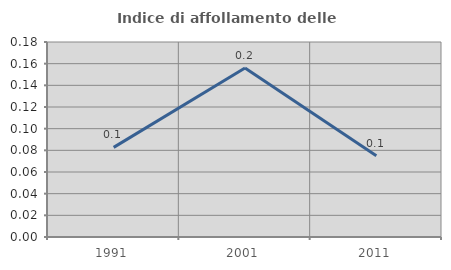
| Category | Indice di affollamento delle abitazioni  |
|---|---|
| 1991.0 | 0.083 |
| 2001.0 | 0.156 |
| 2011.0 | 0.075 |